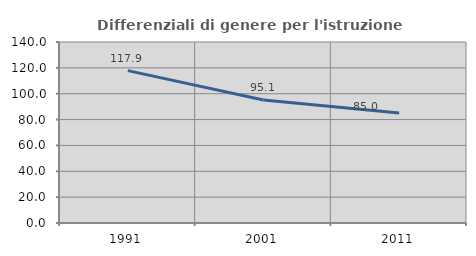
| Category | Differenziali di genere per l'istruzione superiore |
|---|---|
| 1991.0 | 117.872 |
| 2001.0 | 95.102 |
| 2011.0 | 85.008 |